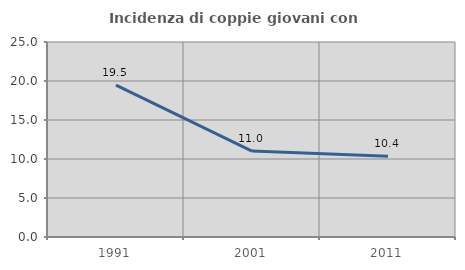
| Category | Incidenza di coppie giovani con figli |
|---|---|
| 1991.0 | 19.474 |
| 2001.0 | 11.021 |
| 2011.0 | 10.362 |